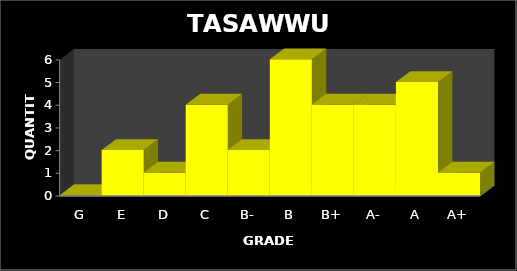
| Category | QUANTITY |
|---|---|
| G | 0 |
| E | 2 |
| D | 1 |
| C | 4 |
| B- | 2 |
| B | 6 |
| B+ | 4 |
| A- | 4 |
| A | 5 |
| A+ | 1 |